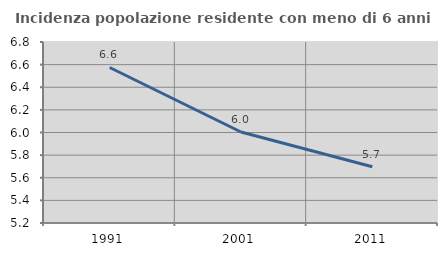
| Category | Incidenza popolazione residente con meno di 6 anni |
|---|---|
| 1991.0 | 6.575 |
| 2001.0 | 6.004 |
| 2011.0 | 5.697 |